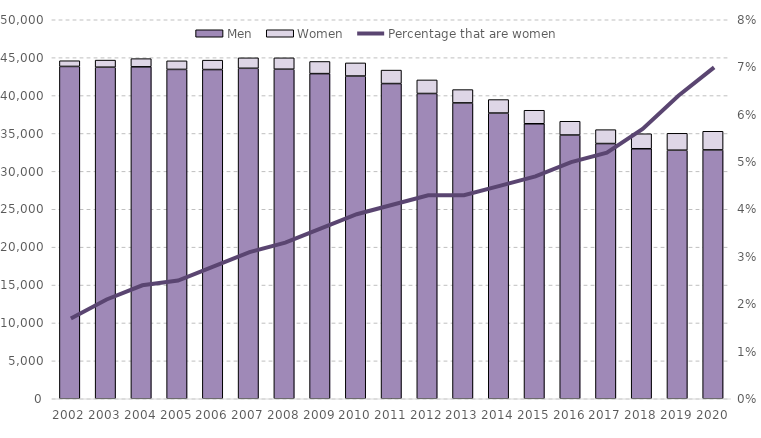
| Category | Men | Women |
|---|---|---|
| 2002.0 | 43841 | 753 |
| 2003.0 | 43741 | 938 |
| 2004.0 | 43790 | 1081 |
| 2005.0 | 43450 | 1132 |
| 2006.0 | 43432 | 1239 |
| 2007.0 | 43596 | 1382 |
| 2008.0 | 43476 | 1502 |
| 2009.0 | 42893 | 1605 |
| 2010.0 | 42574 | 1733 |
| 2011.0 | 41582 | 1778 |
| 2012.0 | 40271 | 1791 |
| 2013.0 | 39030 | 1756 |
| 2014.0 | 37690 | 1782 |
| 2015.0 | 36278 | 1783 |
| 2016.0 | 34793 | 1817 |
| 2017.0 | 33669 | 1832 |
| 2018.0 | 32982 | 1980 |
| 2019.0 | 32791 | 2231 |
| 2020.0 | 32829 | 2461 |